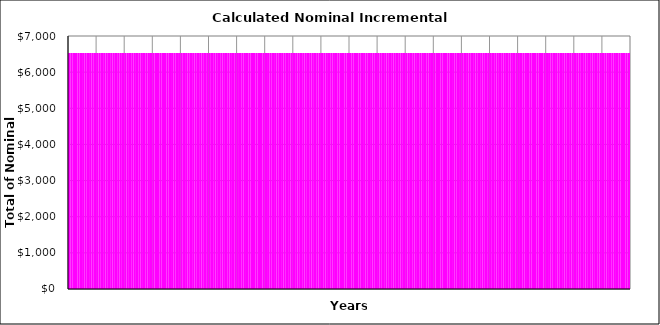
| Category | Stage (1) | Stage (2) | Stage (3) | Stage (4) | Stage (5) | Stage (6) | Stage (7) | Stage (8) | Stage (9) | Stage (10) |
|---|---|---|---|---|---|---|---|---|---|---|
| 0 | 6529.167 | 0 | 0 | 0 | 0 | 0 | 0 | 0 | 0 | 0 |
| 1 | 6529.167 | 0 | 0 | 0 | 0 | 0 | 0 | 0 | 0 | 0 |
| 2 | 6529.167 | 0 | 0 | 0 | 0 | 0 | 0 | 0 | 0 | 0 |
| 3 | 6529.167 | 0 | 0 | 0 | 0 | 0 | 0 | 0 | 0 | 0 |
| 4 | 6529.167 | 0 | 0 | 0 | 0 | 0 | 0 | 0 | 0 | 0 |
| 5 | 6529.167 | 0 | 0 | 0 | 0 | 0 | 0 | 0 | 0 | 0 |
| 6 | 6529.167 | 0 | 0 | 0 | 0 | 0 | 0 | 0 | 0 | 0 |
| 7 | 6529.167 | 0 | 0 | 0 | 0 | 0 | 0 | 0 | 0 | 0 |
| 8 | 6529.167 | 0 | 0 | 0 | 0 | 0 | 0 | 0 | 0 | 0 |
| 9 | 6529.167 | 0 | 0 | 0 | 0 | 0 | 0 | 0 | 0 | 0 |
| 10 | 6529.167 | 0 | 0 | 0 | 0 | 0 | 0 | 0 | 0 | 0 |
| 11 | 6529.167 | 0 | 0 | 0 | 0 | 0 | 0 | 0 | 0 | 0 |
| 12 | 6529.167 | 0 | 0 | 0 | 0 | 0 | 0 | 0 | 0 | 0 |
| 13 | 6529.167 | 0 | 0 | 0 | 0 | 0 | 0 | 0 | 0 | 0 |
| 14 | 6529.167 | 0 | 0 | 0 | 0 | 0 | 0 | 0 | 0 | 0 |
| 15 | 6529.167 | 0 | 0 | 0 | 0 | 0 | 0 | 0 | 0 | 0 |
| 16 | 6529.167 | 0 | 0 | 0 | 0 | 0 | 0 | 0 | 0 | 0 |
| 17 | 6529.167 | 0 | 0 | 0 | 0 | 0 | 0 | 0 | 0 | 0 |
| 18 | 6529.167 | 0 | 0 | 0 | 0 | 0 | 0 | 0 | 0 | 0 |
| 19 | 6529.167 | 0 | 0 | 0 | 0 | 0 | 0 | 0 | 0 | 0 |
| 20 | 6529.167 | 0 | 0 | 0 | 0 | 0 | 0 | 0 | 0 | 0 |
| 21 | 6529.167 | 0 | 0 | 0 | 0 | 0 | 0 | 0 | 0 | 0 |
| 22 | 6529.167 | 0 | 0 | 0 | 0 | 0 | 0 | 0 | 0 | 0 |
| 23 | 6529.167 | 0 | 0 | 0 | 0 | 0 | 0 | 0 | 0 | 0 |
| 24 | 6529.167 | 0 | 0 | 0 | 0 | 0 | 0 | 0 | 0 | 0 |
| 25 | 6529.167 | 0 | 0 | 0 | 0 | 0 | 0 | 0 | 0 | 0 |
| 26 | 6529.167 | 0 | 0 | 0 | 0 | 0 | 0 | 0 | 0 | 0 |
| 27 | 6529.167 | 0 | 0 | 0 | 0 | 0 | 0 | 0 | 0 | 0 |
| 28 | 6529.167 | 0 | 0 | 0 | 0 | 0 | 0 | 0 | 0 | 0 |
| 29 | 6529.167 | 0 | 0 | 0 | 0 | 0 | 0 | 0 | 0 | 0 |
| 30 | 6529.167 | 0 | 0 | 0 | 0 | 0 | 0 | 0 | 0 | 0 |
| 31 | 6529.167 | 0 | 0 | 0 | 0 | 0 | 0 | 0 | 0 | 0 |
| 32 | 6529.167 | 0 | 0 | 0 | 0 | 0 | 0 | 0 | 0 | 0 |
| 33 | 6529.167 | 0 | 0 | 0 | 0 | 0 | 0 | 0 | 0 | 0 |
| 34 | 6529.167 | 0 | 0 | 0 | 0 | 0 | 0 | 0 | 0 | 0 |
| 35 | 6529.167 | 0 | 0 | 0 | 0 | 0 | 0 | 0 | 0 | 0 |
| 36 | 6529.167 | 0 | 0 | 0 | 0 | 0 | 0 | 0 | 0 | 0 |
| 37 | 6529.167 | 0 | 0 | 0 | 0 | 0 | 0 | 0 | 0 | 0 |
| 38 | 6529.167 | 0 | 0 | 0 | 0 | 0 | 0 | 0 | 0 | 0 |
| 39 | 6529.167 | 0 | 0 | 0 | 0 | 0 | 0 | 0 | 0 | 0 |
| 40 | 6529.167 | 0 | 0 | 0 | 0 | 0 | 0 | 0 | 0 | 0 |
| 41 | 6529.167 | 0 | 0 | 0 | 0 | 0 | 0 | 0 | 0 | 0 |
| 42 | 6529.167 | 0 | 0 | 0 | 0 | 0 | 0 | 0 | 0 | 0 |
| 43 | 6529.167 | 0 | 0 | 0 | 0 | 0 | 0 | 0 | 0 | 0 |
| 44 | 6529.167 | 0 | 0 | 0 | 0 | 0 | 0 | 0 | 0 | 0 |
| 45 | 6529.167 | 0 | 0 | 0 | 0 | 0 | 0 | 0 | 0 | 0 |
| 46 | 6529.167 | 0 | 0 | 0 | 0 | 0 | 0 | 0 | 0 | 0 |
| 47 | 6529.167 | 0 | 0 | 0 | 0 | 0 | 0 | 0 | 0 | 0 |
| 48 | 6529.167 | 0 | 0 | 0 | 0 | 0 | 0 | 0 | 0 | 0 |
| 49 | 6529.167 | 0 | 0 | 0 | 0 | 0 | 0 | 0 | 0 | 0 |
| 50 | 6529.167 | 0 | 0 | 0 | 0 | 0 | 0 | 0 | 0 | 0 |
| 51 | 6529.167 | 0 | 0 | 0 | 0 | 0 | 0 | 0 | 0 | 0 |
| 52 | 6529.167 | 0 | 0 | 0 | 0 | 0 | 0 | 0 | 0 | 0 |
| 53 | 6529.167 | 0 | 0 | 0 | 0 | 0 | 0 | 0 | 0 | 0 |
| 54 | 6529.167 | 0 | 0 | 0 | 0 | 0 | 0 | 0 | 0 | 0 |
| 55 | 6529.167 | 0 | 0 | 0 | 0 | 0 | 0 | 0 | 0 | 0 |
| 56 | 6529.167 | 0 | 0 | 0 | 0 | 0 | 0 | 0 | 0 | 0 |
| 57 | 6529.167 | 0 | 0 | 0 | 0 | 0 | 0 | 0 | 0 | 0 |
| 58 | 6529.167 | 0 | 0 | 0 | 0 | 0 | 0 | 0 | 0 | 0 |
| 59 | 6529.167 | 0 | 0 | 0 | 0 | 0 | 0 | 0 | 0 | 0 |
| 60 | 6529.167 | 0 | 0 | 0 | 0 | 0 | 0 | 0 | 0 | 0 |
| 61 | 6529.167 | 0 | 0 | 0 | 0 | 0 | 0 | 0 | 0 | 0 |
| 62 | 6529.167 | 0 | 0 | 0 | 0 | 0 | 0 | 0 | 0 | 0 |
| 63 | 6529.167 | 0 | 0 | 0 | 0 | 0 | 0 | 0 | 0 | 0 |
| 64 | 6529.167 | 0 | 0 | 0 | 0 | 0 | 0 | 0 | 0 | 0 |
| 65 | 6529.167 | 0 | 0 | 0 | 0 | 0 | 0 | 0 | 0 | 0 |
| 66 | 6529.167 | 0 | 0 | 0 | 0 | 0 | 0 | 0 | 0 | 0 |
| 67 | 6529.167 | 0 | 0 | 0 | 0 | 0 | 0 | 0 | 0 | 0 |
| 68 | 6529.167 | 0 | 0 | 0 | 0 | 0 | 0 | 0 | 0 | 0 |
| 69 | 6529.167 | 0 | 0 | 0 | 0 | 0 | 0 | 0 | 0 | 0 |
| 70 | 6529.167 | 0 | 0 | 0 | 0 | 0 | 0 | 0 | 0 | 0 |
| 71 | 6529.167 | 0 | 0 | 0 | 0 | 0 | 0 | 0 | 0 | 0 |
| 72 | 6529.167 | 0 | 0 | 0 | 0 | 0 | 0 | 0 | 0 | 0 |
| 73 | 6529.167 | 0 | 0 | 0 | 0 | 0 | 0 | 0 | 0 | 0 |
| 74 | 6529.167 | 0 | 0 | 0 | 0 | 0 | 0 | 0 | 0 | 0 |
| 75 | 6529.167 | 0 | 0 | 0 | 0 | 0 | 0 | 0 | 0 | 0 |
| 76 | 6529.167 | 0 | 0 | 0 | 0 | 0 | 0 | 0 | 0 | 0 |
| 77 | 6529.167 | 0 | 0 | 0 | 0 | 0 | 0 | 0 | 0 | 0 |
| 78 | 6529.167 | 0 | 0 | 0 | 0 | 0 | 0 | 0 | 0 | 0 |
| 79 | 6529.167 | 0 | 0 | 0 | 0 | 0 | 0 | 0 | 0 | 0 |
| 80 | 6529.167 | 0 | 0 | 0 | 0 | 0 | 0 | 0 | 0 | 0 |
| 81 | 6529.167 | 0 | 0 | 0 | 0 | 0 | 0 | 0 | 0 | 0 |
| 82 | 6529.167 | 0 | 0 | 0 | 0 | 0 | 0 | 0 | 0 | 0 |
| 83 | 6529.167 | 0 | 0 | 0 | 0 | 0 | 0 | 0 | 0 | 0 |
| 84 | 6529.167 | 0 | 0 | 0 | 0 | 0 | 0 | 0 | 0 | 0 |
| 85 | 6529.167 | 0 | 0 | 0 | 0 | 0 | 0 | 0 | 0 | 0 |
| 86 | 6529.167 | 0 | 0 | 0 | 0 | 0 | 0 | 0 | 0 | 0 |
| 87 | 6529.167 | 0 | 0 | 0 | 0 | 0 | 0 | 0 | 0 | 0 |
| 88 | 6529.167 | 0 | 0 | 0 | 0 | 0 | 0 | 0 | 0 | 0 |
| 89 | 6529.167 | 0 | 0 | 0 | 0 | 0 | 0 | 0 | 0 | 0 |
| 90 | 6529.167 | 0 | 0 | 0 | 0 | 0 | 0 | 0 | 0 | 0 |
| 91 | 6529.167 | 0 | 0 | 0 | 0 | 0 | 0 | 0 | 0 | 0 |
| 92 | 6529.167 | 0 | 0 | 0 | 0 | 0 | 0 | 0 | 0 | 0 |
| 93 | 6529.167 | 0 | 0 | 0 | 0 | 0 | 0 | 0 | 0 | 0 |
| 94 | 6529.167 | 0 | 0 | 0 | 0 | 0 | 0 | 0 | 0 | 0 |
| 95 | 6529.167 | 0 | 0 | 0 | 0 | 0 | 0 | 0 | 0 | 0 |
| 96 | 6529.167 | 0 | 0 | 0 | 0 | 0 | 0 | 0 | 0 | 0 |
| 97 | 6529.167 | 0 | 0 | 0 | 0 | 0 | 0 | 0 | 0 | 0 |
| 98 | 6529.167 | 0 | 0 | 0 | 0 | 0 | 0 | 0 | 0 | 0 |
| 99 | 6529.167 | 0 | 0 | 0 | 0 | 0 | 0 | 0 | 0 | 0 |
| 100 | 6529.167 | 0 | 0 | 0 | 0 | 0 | 0 | 0 | 0 | 0 |
| 101 | 6529.167 | 0 | 0 | 0 | 0 | 0 | 0 | 0 | 0 | 0 |
| 102 | 6529.167 | 0 | 0 | 0 | 0 | 0 | 0 | 0 | 0 | 0 |
| 103 | 6529.167 | 0 | 0 | 0 | 0 | 0 | 0 | 0 | 0 | 0 |
| 104 | 6529.167 | 0 | 0 | 0 | 0 | 0 | 0 | 0 | 0 | 0 |
| 105 | 6529.167 | 0 | 0 | 0 | 0 | 0 | 0 | 0 | 0 | 0 |
| 106 | 6529.167 | 0 | 0 | 0 | 0 | 0 | 0 | 0 | 0 | 0 |
| 107 | 6529.167 | 0 | 0 | 0 | 0 | 0 | 0 | 0 | 0 | 0 |
| 108 | 6529.167 | 0 | 0 | 0 | 0 | 0 | 0 | 0 | 0 | 0 |
| 109 | 6529.167 | 0 | 0 | 0 | 0 | 0 | 0 | 0 | 0 | 0 |
| 110 | 6529.167 | 0 | 0 | 0 | 0 | 0 | 0 | 0 | 0 | 0 |
| 111 | 6529.167 | 0 | 0 | 0 | 0 | 0 | 0 | 0 | 0 | 0 |
| 112 | 6529.167 | 0 | 0 | 0 | 0 | 0 | 0 | 0 | 0 | 0 |
| 113 | 6529.167 | 0 | 0 | 0 | 0 | 0 | 0 | 0 | 0 | 0 |
| 114 | 6529.167 | 0 | 0 | 0 | 0 | 0 | 0 | 0 | 0 | 0 |
| 115 | 6529.167 | 0 | 0 | 0 | 0 | 0 | 0 | 0 | 0 | 0 |
| 116 | 6529.167 | 0 | 0 | 0 | 0 | 0 | 0 | 0 | 0 | 0 |
| 117 | 6529.167 | 0 | 0 | 0 | 0 | 0 | 0 | 0 | 0 | 0 |
| 118 | 6529.167 | 0 | 0 | 0 | 0 | 0 | 0 | 0 | 0 | 0 |
| 119 | 6529.167 | 0 | 0 | 0 | 0 | 0 | 0 | 0 | 0 | 0 |
| 120 | 6529.167 | 0 | 0 | 0 | 0 | 0 | 0 | 0 | 0 | 0 |
| 121 | 6529.167 | 0 | 0 | 0 | 0 | 0 | 0 | 0 | 0 | 0 |
| 122 | 6529.167 | 0 | 0 | 0 | 0 | 0 | 0 | 0 | 0 | 0 |
| 123 | 6529.167 | 0 | 0 | 0 | 0 | 0 | 0 | 0 | 0 | 0 |
| 124 | 6529.167 | 0 | 0 | 0 | 0 | 0 | 0 | 0 | 0 | 0 |
| 125 | 6529.167 | 0 | 0 | 0 | 0 | 0 | 0 | 0 | 0 | 0 |
| 126 | 6529.167 | 0 | 0 | 0 | 0 | 0 | 0 | 0 | 0 | 0 |
| 127 | 6529.167 | 0 | 0 | 0 | 0 | 0 | 0 | 0 | 0 | 0 |
| 128 | 6529.167 | 0 | 0 | 0 | 0 | 0 | 0 | 0 | 0 | 0 |
| 129 | 6529.167 | 0 | 0 | 0 | 0 | 0 | 0 | 0 | 0 | 0 |
| 130 | 6529.167 | 0 | 0 | 0 | 0 | 0 | 0 | 0 | 0 | 0 |
| 131 | 6529.167 | 0 | 0 | 0 | 0 | 0 | 0 | 0 | 0 | 0 |
| 132 | 6529.167 | 0 | 0 | 0 | 0 | 0 | 0 | 0 | 0 | 0 |
| 133 | 6529.167 | 0 | 0 | 0 | 0 | 0 | 0 | 0 | 0 | 0 |
| 134 | 6529.167 | 0 | 0 | 0 | 0 | 0 | 0 | 0 | 0 | 0 |
| 135 | 6529.167 | 0 | 0 | 0 | 0 | 0 | 0 | 0 | 0 | 0 |
| 136 | 6529.167 | 0 | 0 | 0 | 0 | 0 | 0 | 0 | 0 | 0 |
| 137 | 6529.167 | 0 | 0 | 0 | 0 | 0 | 0 | 0 | 0 | 0 |
| 138 | 6529.167 | 0 | 0 | 0 | 0 | 0 | 0 | 0 | 0 | 0 |
| 139 | 6529.167 | 0 | 0 | 0 | 0 | 0 | 0 | 0 | 0 | 0 |
| 140 | 6529.167 | 0 | 0 | 0 | 0 | 0 | 0 | 0 | 0 | 0 |
| 141 | 6529.167 | 0 | 0 | 0 | 0 | 0 | 0 | 0 | 0 | 0 |
| 142 | 6529.167 | 0 | 0 | 0 | 0 | 0 | 0 | 0 | 0 | 0 |
| 143 | 6529.167 | 0 | 0 | 0 | 0 | 0 | 0 | 0 | 0 | 0 |
| 144 | 6529.167 | 0 | 0 | 0 | 0 | 0 | 0 | 0 | 0 | 0 |
| 145 | 6529.167 | 0 | 0 | 0 | 0 | 0 | 0 | 0 | 0 | 0 |
| 146 | 6529.167 | 0 | 0 | 0 | 0 | 0 | 0 | 0 | 0 | 0 |
| 147 | 6529.167 | 0 | 0 | 0 | 0 | 0 | 0 | 0 | 0 | 0 |
| 148 | 6529.167 | 0 | 0 | 0 | 0 | 0 | 0 | 0 | 0 | 0 |
| 149 | 6529.167 | 0 | 0 | 0 | 0 | 0 | 0 | 0 | 0 | 0 |
| 150 | 6529.167 | 0 | 0 | 0 | 0 | 0 | 0 | 0 | 0 | 0 |
| 151 | 6529.167 | 0 | 0 | 0 | 0 | 0 | 0 | 0 | 0 | 0 |
| 152 | 6529.167 | 0 | 0 | 0 | 0 | 0 | 0 | 0 | 0 | 0 |
| 153 | 6529.167 | 0 | 0 | 0 | 0 | 0 | 0 | 0 | 0 | 0 |
| 154 | 6529.167 | 0 | 0 | 0 | 0 | 0 | 0 | 0 | 0 | 0 |
| 155 | 6529.167 | 0 | 0 | 0 | 0 | 0 | 0 | 0 | 0 | 0 |
| 156 | 6529.167 | 0 | 0 | 0 | 0 | 0 | 0 | 0 | 0 | 0 |
| 157 | 6529.167 | 0 | 0 | 0 | 0 | 0 | 0 | 0 | 0 | 0 |
| 158 | 6529.167 | 0 | 0 | 0 | 0 | 0 | 0 | 0 | 0 | 0 |
| 159 | 6529.167 | 0 | 0 | 0 | 0 | 0 | 0 | 0 | 0 | 0 |
| 160 | 6529.167 | 0 | 0 | 0 | 0 | 0 | 0 | 0 | 0 | 0 |
| 161 | 6529.167 | 0 | 0 | 0 | 0 | 0 | 0 | 0 | 0 | 0 |
| 162 | 6529.167 | 0 | 0 | 0 | 0 | 0 | 0 | 0 | 0 | 0 |
| 163 | 6529.167 | 0 | 0 | 0 | 0 | 0 | 0 | 0 | 0 | 0 |
| 164 | 6529.167 | 0 | 0 | 0 | 0 | 0 | 0 | 0 | 0 | 0 |
| 165 | 6529.167 | 0 | 0 | 0 | 0 | 0 | 0 | 0 | 0 | 0 |
| 166 | 6529.167 | 0 | 0 | 0 | 0 | 0 | 0 | 0 | 0 | 0 |
| 167 | 6529.167 | 0 | 0 | 0 | 0 | 0 | 0 | 0 | 0 | 0 |
| 168 | 6529.167 | 0 | 0 | 0 | 0 | 0 | 0 | 0 | 0 | 0 |
| 169 | 6529.167 | 0 | 0 | 0 | 0 | 0 | 0 | 0 | 0 | 0 |
| 170 | 6529.167 | 0 | 0 | 0 | 0 | 0 | 0 | 0 | 0 | 0 |
| 171 | 6529.167 | 0 | 0 | 0 | 0 | 0 | 0 | 0 | 0 | 0 |
| 172 | 6529.167 | 0 | 0 | 0 | 0 | 0 | 0 | 0 | 0 | 0 |
| 173 | 6529.167 | 0 | 0 | 0 | 0 | 0 | 0 | 0 | 0 | 0 |
| 174 | 6529.167 | 0 | 0 | 0 | 0 | 0 | 0 | 0 | 0 | 0 |
| 175 | 6529.167 | 0 | 0 | 0 | 0 | 0 | 0 | 0 | 0 | 0 |
| 176 | 6529.167 | 0 | 0 | 0 | 0 | 0 | 0 | 0 | 0 | 0 |
| 177 | 6529.167 | 0 | 0 | 0 | 0 | 0 | 0 | 0 | 0 | 0 |
| 178 | 6529.167 | 0 | 0 | 0 | 0 | 0 | 0 | 0 | 0 | 0 |
| 179 | 6529.167 | 0 | 0 | 0 | 0 | 0 | 0 | 0 | 0 | 0 |
| 180 | 6529.167 | 0 | 0 | 0 | 0 | 0 | 0 | 0 | 0 | 0 |
| 181 | 6529.167 | 0 | 0 | 0 | 0 | 0 | 0 | 0 | 0 | 0 |
| 182 | 6529.167 | 0 | 0 | 0 | 0 | 0 | 0 | 0 | 0 | 0 |
| 183 | 6529.167 | 0 | 0 | 0 | 0 | 0 | 0 | 0 | 0 | 0 |
| 184 | 6529.167 | 0 | 0 | 0 | 0 | 0 | 0 | 0 | 0 | 0 |
| 185 | 6529.167 | 0 | 0 | 0 | 0 | 0 | 0 | 0 | 0 | 0 |
| 186 | 6529.167 | 0 | 0 | 0 | 0 | 0 | 0 | 0 | 0 | 0 |
| 187 | 6529.167 | 0 | 0 | 0 | 0 | 0 | 0 | 0 | 0 | 0 |
| 188 | 6529.167 | 0 | 0 | 0 | 0 | 0 | 0 | 0 | 0 | 0 |
| 189 | 6529.167 | 0 | 0 | 0 | 0 | 0 | 0 | 0 | 0 | 0 |
| 190 | 6529.167 | 0 | 0 | 0 | 0 | 0 | 0 | 0 | 0 | 0 |
| 191 | 6529.167 | 0 | 0 | 0 | 0 | 0 | 0 | 0 | 0 | 0 |
| 192 | 6529.167 | 0 | 0 | 0 | 0 | 0 | 0 | 0 | 0 | 0 |
| 193 | 6529.167 | 0 | 0 | 0 | 0 | 0 | 0 | 0 | 0 | 0 |
| 194 | 6529.167 | 0 | 0 | 0 | 0 | 0 | 0 | 0 | 0 | 0 |
| 195 | 6529.167 | 0 | 0 | 0 | 0 | 0 | 0 | 0 | 0 | 0 |
| 196 | 6529.167 | 0 | 0 | 0 | 0 | 0 | 0 | 0 | 0 | 0 |
| 197 | 6529.167 | 0 | 0 | 0 | 0 | 0 | 0 | 0 | 0 | 0 |
| 198 | 6529.167 | 0 | 0 | 0 | 0 | 0 | 0 | 0 | 0 | 0 |
| 199 | 6529.167 | 0 | 0 | 0 | 0 | 0 | 0 | 0 | 0 | 0 |
| 200 | 6529.167 | 0 | 0 | 0 | 0 | 0 | 0 | 0 | 0 | 0 |
| 201 | 6529.167 | 0 | 0 | 0 | 0 | 0 | 0 | 0 | 0 | 0 |
| 202 | 6529.167 | 0 | 0 | 0 | 0 | 0 | 0 | 0 | 0 | 0 |
| 203 | 6529.167 | 0 | 0 | 0 | 0 | 0 | 0 | 0 | 0 | 0 |
| 204 | 6529.167 | 0 | 0 | 0 | 0 | 0 | 0 | 0 | 0 | 0 |
| 205 | 6529.167 | 0 | 0 | 0 | 0 | 0 | 0 | 0 | 0 | 0 |
| 206 | 6529.167 | 0 | 0 | 0 | 0 | 0 | 0 | 0 | 0 | 0 |
| 207 | 6529.167 | 0 | 0 | 0 | 0 | 0 | 0 | 0 | 0 | 0 |
| 208 | 6529.167 | 0 | 0 | 0 | 0 | 0 | 0 | 0 | 0 | 0 |
| 209 | 6529.167 | 0 | 0 | 0 | 0 | 0 | 0 | 0 | 0 | 0 |
| 210 | 6529.167 | 0 | 0 | 0 | 0 | 0 | 0 | 0 | 0 | 0 |
| 211 | 6529.167 | 0 | 0 | 0 | 0 | 0 | 0 | 0 | 0 | 0 |
| 212 | 6529.167 | 0 | 0 | 0 | 0 | 0 | 0 | 0 | 0 | 0 |
| 213 | 6529.167 | 0 | 0 | 0 | 0 | 0 | 0 | 0 | 0 | 0 |
| 214 | 6529.167 | 0 | 0 | 0 | 0 | 0 | 0 | 0 | 0 | 0 |
| 215 | 6529.167 | 0 | 0 | 0 | 0 | 0 | 0 | 0 | 0 | 0 |
| 216 | 6529.167 | 0 | 0 | 0 | 0 | 0 | 0 | 0 | 0 | 0 |
| 217 | 6529.167 | 0 | 0 | 0 | 0 | 0 | 0 | 0 | 0 | 0 |
| 218 | 6529.167 | 0 | 0 | 0 | 0 | 0 | 0 | 0 | 0 | 0 |
| 219 | 6529.167 | 0 | 0 | 0 | 0 | 0 | 0 | 0 | 0 | 0 |
| 220 | 6529.167 | 0 | 0 | 0 | 0 | 0 | 0 | 0 | 0 | 0 |
| 221 | 6529.167 | 0 | 0 | 0 | 0 | 0 | 0 | 0 | 0 | 0 |
| 222 | 6529.167 | 0 | 0 | 0 | 0 | 0 | 0 | 0 | 0 | 0 |
| 223 | 6529.167 | 0 | 0 | 0 | 0 | 0 | 0 | 0 | 0 | 0 |
| 224 | 6529.167 | 0 | 0 | 0 | 0 | 0 | 0 | 0 | 0 | 0 |
| 225 | 6529.167 | 0 | 0 | 0 | 0 | 0 | 0 | 0 | 0 | 0 |
| 226 | 6529.167 | 0 | 0 | 0 | 0 | 0 | 0 | 0 | 0 | 0 |
| 227 | 6529.167 | 0 | 0 | 0 | 0 | 0 | 0 | 0 | 0 | 0 |
| 228 | 6529.167 | 0 | 0 | 0 | 0 | 0 | 0 | 0 | 0 | 0 |
| 229 | 6529.167 | 0 | 0 | 0 | 0 | 0 | 0 | 0 | 0 | 0 |
| 230 | 6529.167 | 0 | 0 | 0 | 0 | 0 | 0 | 0 | 0 | 0 |
| 231 | 6529.167 | 0 | 0 | 0 | 0 | 0 | 0 | 0 | 0 | 0 |
| 232 | 6529.167 | 0 | 0 | 0 | 0 | 0 | 0 | 0 | 0 | 0 |
| 233 | 6529.167 | 0 | 0 | 0 | 0 | 0 | 0 | 0 | 0 | 0 |
| 234 | 6529.167 | 0 | 0 | 0 | 0 | 0 | 0 | 0 | 0 | 0 |
| 235 | 6529.167 | 0 | 0 | 0 | 0 | 0 | 0 | 0 | 0 | 0 |
| 236 | 6529.167 | 0 | 0 | 0 | 0 | 0 | 0 | 0 | 0 | 0 |
| 237 | 6529.167 | 0 | 0 | 0 | 0 | 0 | 0 | 0 | 0 | 0 |
| 238 | 6529.167 | 0 | 0 | 0 | 0 | 0 | 0 | 0 | 0 | 0 |
| 239 | 6529.167 | 0 | 0 | 0 | 0 | 0 | 0 | 0 | 0 | 0 |